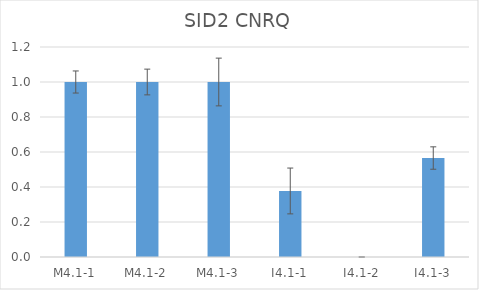
| Category | SID2 CNRQ |
|---|---|
| M4.1-1 | 1 |
| M4.1-2 | 1 |
| M4.1-3 | 1 |
| I4.1-1 | 0.377 |
| I4.1-2 | 0 |
| I4.1-3 | 0.566 |